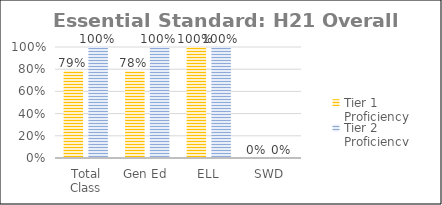
| Category | Tier 1 Proficiency | Tier 2 Proficiency |
|---|---|---|
| Total Class | 0.786 | 1 |
| Gen Ed | 0.782 | 1 |
| ELL | 1 | 1 |
| SWD | 0 | 0 |